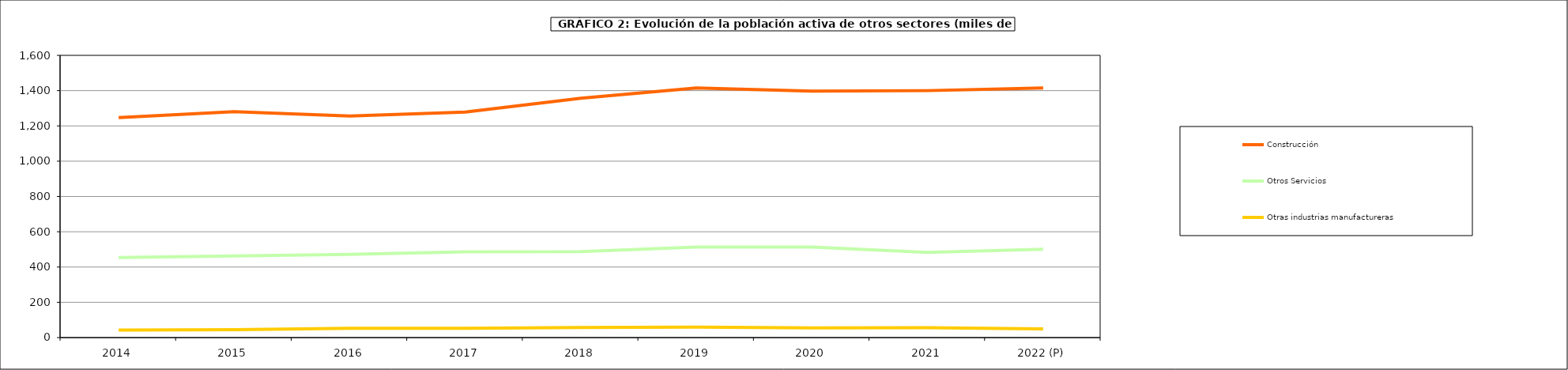
| Category | Construcción | Otros Servicios | Otras industrias manufactureras |
|---|---|---|---|
| 2014 | 1247.2 | 454.2 | 42.2 |
| 2015 | 1280.975 | 462.325 | 44.95 |
| 2016 | 1256.45 | 471.23 | 52.98 |
| 2017 | 1278.6 | 486.4 | 52.6 |
| 2018 | 1356.625 | 486.875 | 57 |
| 2019 | 1415.25 | 513.675 | 59.45 |
| 2020 | 1397.475 | 512.975 | 55.3 |
| 2021 | 1400 | 483 | 55.9 |
| 2022 (P) | 1415.6 | 500.3 | 49.3 |